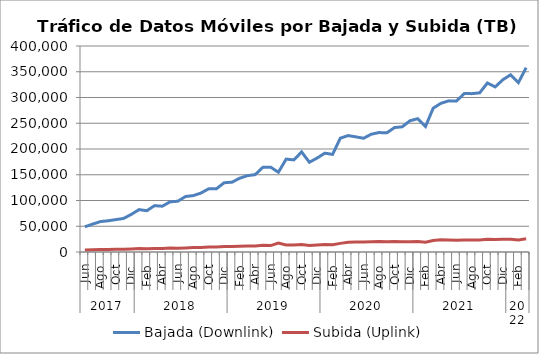
| Category | Bajada (Downlink) | Subida (Uplink) |
|---|---|---|
| 0 | 49031.05 | 4110.083 |
| 1 | 54144.662 | 4576.336 |
| 2 | 59053.884 | 4926.59 |
| 3 | 60615.603 | 5073.856 |
| 4 | 62912.282 | 5241.949 |
| 5 | 65116.652 | 5430.774 |
| 6 | 73085.593 | 5979.615 |
| 7 | 82305.176 | 6615.846 |
| 8 | 80168.923 | 6368.904 |
| 9 | 90017.001 | 6987.156 |
| 10 | 88889.971 | 6928.309 |
| 11 | 97402.04 | 7732.528 |
| 12 | 98551.021 | 7120.622 |
| 13 | 107733.178 | 7900.363 |
| 14 | 109511.382 | 8593.744 |
| 15 | 114524.119 | 8898.102 |
| 16 | 122756.479 | 9706.983 |
| 17 | 122842.407 | 9785.473 |
| 18 | 134504.781 | 10675.628 |
| 19 | 135546.445 | 10559.493 |
| 20 | 143259.108 | 11096.647 |
| 21 | 148265.34 | 11659.357 |
| 22 | 150224.029 | 11716.276 |
| 23 | 164564.945 | 12874.428 |
| 24 | 164719 | 12499.224 |
| 25 | 154863.199 | 17172.739 |
| 26 | 180338.075 | 13476.103 |
| 27 | 178838.736 | 13659.978 |
| 28 | 194344.149 | 14441.187 |
| 29 | 174291.116 | 12866.358 |
| 30 | 182431.707 | 13776.161 |
| 31 | 191917.817 | 14323.557 |
| 32 | 189551.963 | 13977.923 |
| 33 | 221093.503 | 16746.709 |
| 34 | 226049.098 | 18821.223 |
| 35 | 223567.947 | 19322.251 |
| 36 | 220832.939 | 19459.258 |
| 37 | 228745.976 | 19748.217 |
| 38 | 231942.488 | 20275.03 |
| 39 | 231348.286 | 19841.442 |
| 40 | 241596.699 | 20608.425 |
| 41 | 243127.411 | 19917.731 |
| 42 | 254887.626 | 20007.086 |
| 43 | 258892.252 | 20366.978 |
| 44 | 243708.604 | 18886.601 |
| 45 | 279321.437 | 22200.02 |
| 46 | 288773.726 | 23584.045 |
| 47 | 293480.145 | 23451.121 |
| 48 | 293069.012 | 22768.07 |
| 49 | 307662.273 | 23101.137 |
| 50 | 307499.817 | 23475.003 |
| 51 | 309040.252 | 23275.43 |
| 52 | 328204.733 | 24531.868 |
| 53 | 320532.976 | 24188.841 |
| 54 | 334596.283 | 24667.613 |
| 55 | 344128.386 | 24927.851 |
| 56 | 328825.984 | 23539.566 |
| 57 | 357816.168 | 25731.209 |